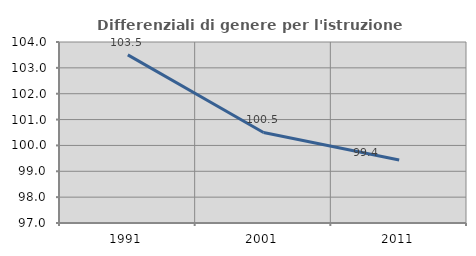
| Category | Differenziali di genere per l'istruzione superiore |
|---|---|
| 1991.0 | 103.501 |
| 2001.0 | 100.503 |
| 2011.0 | 99.437 |